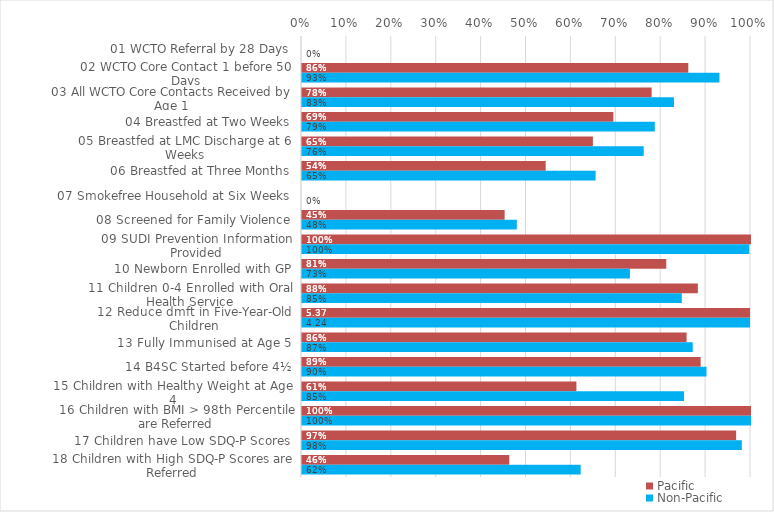
| Category | Pacific | Non-Pacific |
|---|---|---|
| 01 WCTO Referral by 28 Days | 0 | 0 |
| 02 WCTO Core Contact 1 before 50 Days | 0.86 | 0.93 |
| 03 All WCTO Core Contacts Received by Age 1 | 0.779 | 0.828 |
| 04 Breastfed at Two Weeks | 0.693 | 0.786 |
| 05 Breastfed at LMC Discharge at 6 Weeks | 0.648 | 0.761 |
| 06 Breastfed at Three Months | 0.543 | 0.654 |
| 07 Smokefree Household at Six Weeks | 0 | 0 |
| 08 Screened for Family Violence | 0.451 | 0.478 |
| 09 SUDI Prevention Information Provided | 1 | 0.996 |
| 10 Newborn Enrolled with GP | 0.811 | 0.73 |
| 11 Children 0-4 Enrolled with Oral Health Service | 0.882 | 0.846 |
| 12 Reduce dmft in Five-Year-Old Children | 5.367 | 4.243 |
| 13 Fully Immunised at Age 5 | 0.857 | 0.87 |
| 14 B4SC Started before 4½ | 0.888 | 0.901 |
| 15 Children with Healthy Weight at Age 4 | 0.611 | 0.851 |
| 16 Children with BMI > 98th Percentile are Referred | 1 | 1 |
| 17 Children have Low SDQ-P Scores | 0.967 | 0.98 |
| 18 Children with High SDQ-P Scores are Referred | 0.462 | 0.621 |